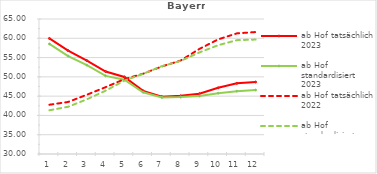
| Category | ab Hof tatsächlich 2023 | ab Hof standardisiert 2023 | ab Hof tatsächlich 2022 | ab Hof standardisiert 2022 |
|---|---|---|---|---|
| 0 | 59.957 | 58.541 | 42.773 | 41.333 |
| 1 | 56.813 | 55.391 | 43.487 | 42.245 |
| 2 | 54.213 | 53.037 | 45.363 | 44.178 |
| 3 | 51.381 | 50.26 | 47.329 | 46.414 |
| 4 | 49.975 | 49.261 | 49.404 | 49.031 |
| 5 | 46.373 | 46.013 | 50.818 | 50.785 |
| 6 | 44.872 | 44.674 | 52.7 | 52.766 |
| 7 | 45.075 | 44.747 | 54.223 | 54.121 |
| 8 | 45.645 | 45.01 | 57.236 | 56.329 |
| 9 | 47.153 | 45.772 | 59.714 | 58.204 |
| 10 | 48.312 | 46.297 | 61.273 | 59.517 |
| 11 | 48.664 | 46.589 | 61.62 | 59.669 |